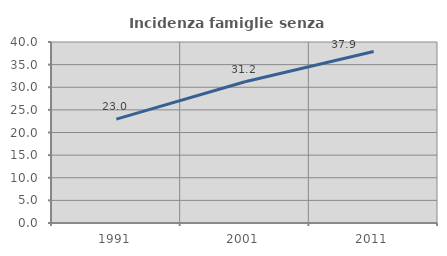
| Category | Incidenza famiglie senza nuclei |
|---|---|
| 1991.0 | 22.952 |
| 2001.0 | 31.215 |
| 2011.0 | 37.893 |